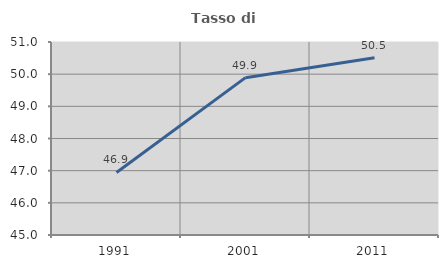
| Category | Tasso di occupazione   |
|---|---|
| 1991.0 | 46.944 |
| 2001.0 | 49.892 |
| 2011.0 | 50.509 |